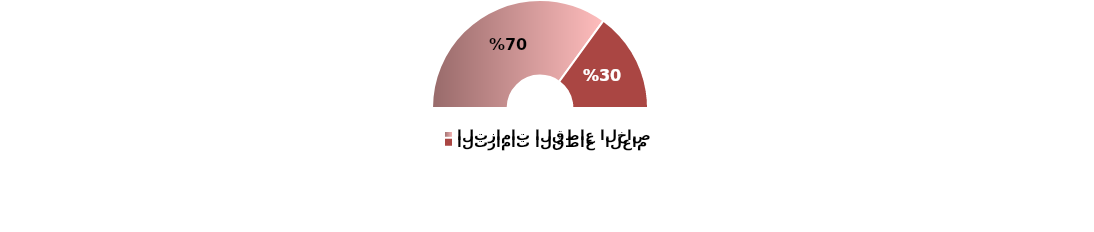
| Category | Series 0 |
|---|---|
| التزامات القطاع الخاص | 0.7 |
| التزامات القطاع  العام | 0.3 |
| المجموع | 1 |